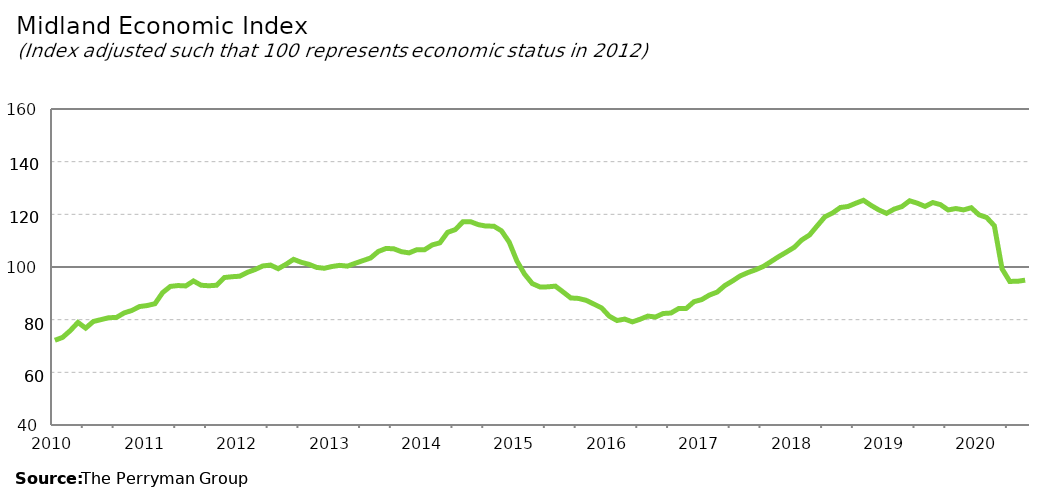
| Category | Midland Composite |
|---|---|
| 2010-01-31 | 72.176 |
| 2010-02-28 | 73.261 |
| 2010-03-31 | 75.839 |
| 2010-04-30 | 78.945 |
| 2010-05-31 | 76.785 |
| 2010-06-30 | 79.312 |
| 2010-07-31 | 80.024 |
| 2010-08-31 | 80.734 |
| 2010-09-30 | 80.836 |
| 2010-10-31 | 82.563 |
| 2010-11-30 | 83.494 |
| 2010-12-31 | 84.98 |
| 2011-01-31 | 85.373 |
| 2011-02-28 | 86.055 |
| 2011-03-31 | 90.294 |
| 2011-04-30 | 92.635 |
| 2011-05-31 | 92.957 |
| 2011-06-30 | 92.811 |
| 2011-07-31 | 94.694 |
| 2011-08-31 | 93.072 |
| 2011-09-30 | 92.876 |
| 2011-10-31 | 93.069 |
| 2011-11-30 | 95.99 |
| 2011-12-31 | 96.308 |
| 2012-01-31 | 96.496 |
| 2012-02-29 | 97.967 |
| 2012-03-31 | 99.038 |
| 2012-04-30 | 100.397 |
| 2012-05-31 | 100.731 |
| 2012-06-30 | 99.352 |
| 2012-07-31 | 100.992 |
| 2012-08-31 | 102.905 |
| 2012-09-30 | 101.787 |
| 2012-10-31 | 101.009 |
| 2012-11-30 | 99.838 |
| 2012-12-31 | 99.525 |
| 2013-01-31 | 100.195 |
| 2013-02-28 | 100.624 |
| 2013-03-31 | 100.33 |
| 2013-04-30 | 101.407 |
| 2013-05-31 | 102.421 |
| 2013-06-30 | 103.423 |
| 2013-07-31 | 105.887 |
| 2013-08-31 | 107.037 |
| 2013-09-30 | 106.923 |
| 2013-10-31 | 105.819 |
| 2013-11-30 | 105.36 |
| 2013-12-31 | 106.559 |
| 2014-01-31 | 106.543 |
| 2014-02-28 | 108.374 |
| 2014-03-31 | 109.173 |
| 2014-04-30 | 113.153 |
| 2014-05-31 | 114.205 |
| 2014-06-30 | 117.199 |
| 2014-07-31 | 117.182 |
| 2014-08-31 | 116.075 |
| 2014-09-30 | 115.527 |
| 2014-10-31 | 115.518 |
| 2014-11-30 | 113.733 |
| 2014-12-31 | 109.455 |
| 2015-01-31 | 102.297 |
| 2015-02-28 | 97.281 |
| 2015-03-31 | 93.702 |
| 2015-04-30 | 92.423 |
| 2015-05-31 | 92.456 |
| 2015-06-30 | 92.732 |
| 2015-07-31 | 90.511 |
| 2015-08-31 | 88.242 |
| 2015-09-30 | 88.064 |
| 2015-10-31 | 87.337 |
| 2015-11-30 | 85.914 |
| 2015-12-31 | 84.458 |
| 2016-01-31 | 81.312 |
| 2016-02-29 | 79.675 |
| 2016-03-31 | 80.223 |
| 2016-04-30 | 79.162 |
| 2016-05-31 | 80.159 |
| 2016-06-30 | 81.355 |
| 2016-07-31 | 81.013 |
| 2016-08-31 | 82.339 |
| 2016-09-30 | 82.523 |
| 2016-10-31 | 84.211 |
| 2016-11-30 | 84.283 |
| 2016-12-31 | 86.826 |
| 2017-01-31 | 87.622 |
| 2017-02-28 | 89.35 |
| 2017-03-31 | 90.46 |
| 2017-04-30 | 92.955 |
| 2017-05-31 | 94.704 |
| 2017-06-30 | 96.617 |
| 2017-07-31 | 97.889 |
| 2017-08-31 | 98.946 |
| 2017-09-30 | 100.209 |
| 2017-10-31 | 102.061 |
| 2017-11-30 | 103.95 |
| 2017-12-31 | 105.658 |
| 2018-01-31 | 107.448 |
| 2018-02-28 | 110.281 |
| 2018-03-31 | 112.152 |
| 2018-04-30 | 115.641 |
| 2018-05-31 | 119.077 |
| 2018-06-30 | 120.523 |
| 2018-07-31 | 122.594 |
| 2018-08-31 | 122.981 |
| 2018-09-30 | 124.209 |
| 2018-10-31 | 125.326 |
| 2018-11-30 | 123.383 |
| 2018-12-31 | 121.674 |
| 2019-01-31 | 120.372 |
| 2019-02-28 | 122.005 |
| 2019-03-31 | 122.951 |
| 2019-04-30 | 125.14 |
| 2019-05-31 | 124.242 |
| 2019-06-30 | 123.003 |
| 2019-07-31 | 124.486 |
| 2019-08-31 | 123.681 |
| 2019-09-30 | 121.661 |
| 2019-10-31 | 122.201 |
| 2019-11-30 | 121.684 |
| 2019-12-31 | 122.507 |
| 2020-01-31 | 119.82 |
| 2020-02-29 | 118.8 |
| 2020-03-31 | 115.668 |
| 2020-04-30 | 99.302 |
| 2020-05-31 | 94.532 |
| 2020-06-30 | 94.559 |
| 2020-07-31 | 95.008 |